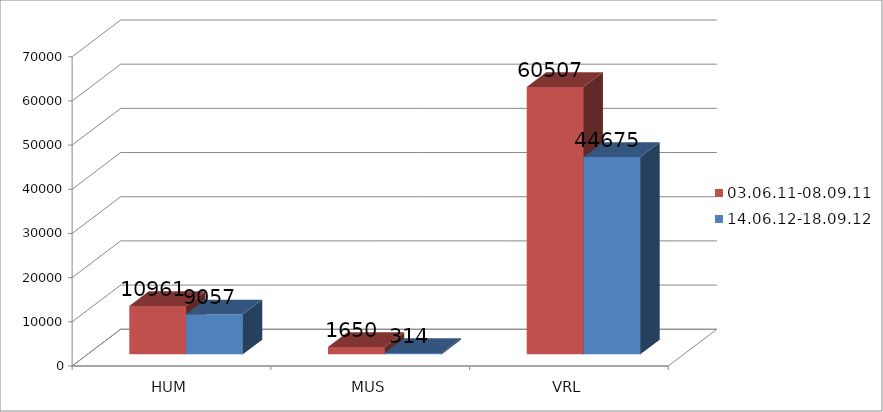
| Category | 03.06.11-08.09.11 | 14.06.12-18.09.12 |
|---|---|---|
| HUM | 10961 | 9057 |
| MUS | 1650 | 314 |
| VRL | 60507 | 44675 |